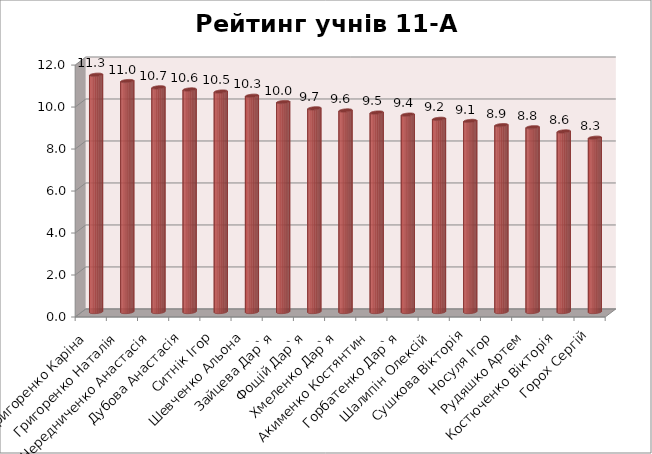
| Category | Series 0 |
|---|---|
|  Григоренко Каріна | 11.3 |
|  Григоренко Наталія | 11 |
| Чередниченко Анастасія | 10.7 |
| Дубова Анастасія | 10.6 |
| Ситнік Ігор | 10.5 |
| Шевченко Альона | 10.3 |
| Зайцева Дар`я | 10 |
| Фощій Дар`я | 9.7 |
| Хмеленко Дар`я | 9.6 |
|  Акименко Костянтин | 9.5 |
|  Горбатенко Дар`я | 9.4 |
| Шалипін Олексій | 9.2 |
| Сушкова Вікторія | 9.1 |
|  Носуля Ігор | 8.9 |
| Рудяшко Артем | 8.8 |
| Костюченко Вікторія | 8.6 |
| Горох Сергій | 8.3 |